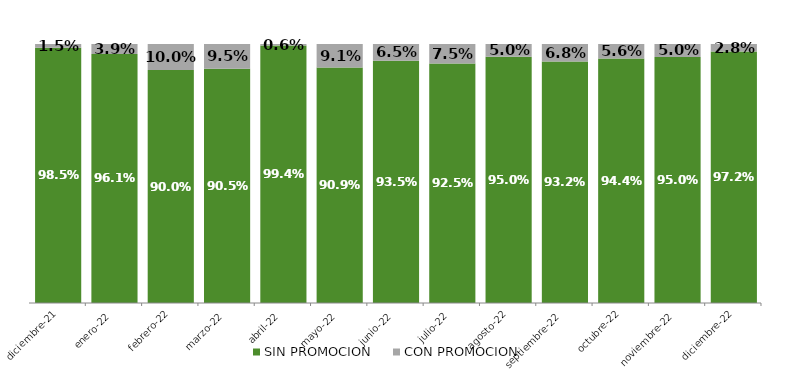
| Category | SIN PROMOCION   | CON PROMOCION   |
|---|---|---|
| 2021-12-01 | 0.985 | 0.015 |
| 2022-01-01 | 0.961 | 0.039 |
| 2022-02-01 | 0.9 | 0.1 |
| 2022-03-01 | 0.905 | 0.095 |
| 2022-04-01 | 0.994 | 0.006 |
| 2022-05-01 | 0.909 | 0.091 |
| 2022-06-01 | 0.935 | 0.065 |
| 2022-07-01 | 0.925 | 0.075 |
| 2022-08-01 | 0.95 | 0.05 |
| 2022-09-01 | 0.932 | 0.068 |
| 2022-10-01 | 0.944 | 0.056 |
| 2022-11-01 | 0.95 | 0.05 |
| 2022-12-01 | 0.972 | 0.028 |